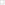
| Category | Series 0 | Series 1 |
|---|---|---|
| Nonwhites | 0.27 | 0.23 |
| White college women | -0.02 | 0.15 |
| White college men | -0.12 | 0.03 |
| White noncollege women | -0.15 | -0.18 |
| White noncollege men | -0.28 | -0.1 |